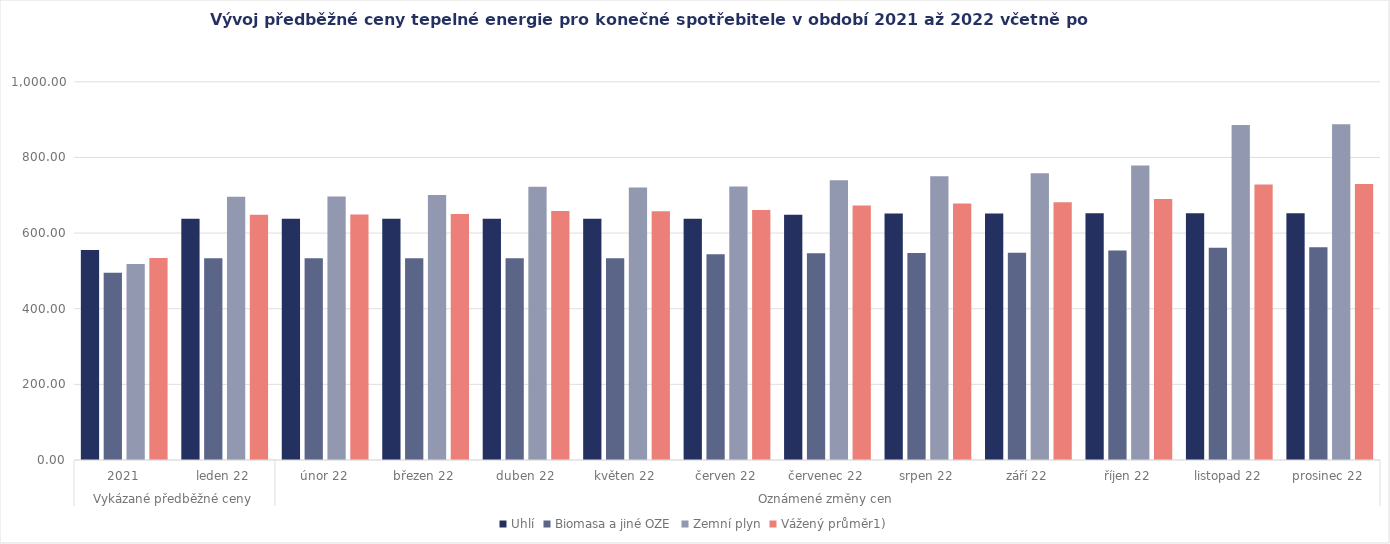
| Category | Uhlí | Biomasa a jiné OZE | Zemní plyn | Vážený průměr1) |
|---|---|---|---|---|
| 0 | 555.538 | 495.363 | 518.187 | 534.275 |
| 1 | 638.007 | 533.733 | 696.096 | 648.715 |
| 2 | 638.128 | 533.733 | 696.981 | 649.097 |
| 3 | 638.128 | 533.733 | 700.547 | 650.394 |
| 4 | 638.13 | 533.736 | 722.827 | 658.473 |
| 5 | 638.137 | 533.736 | 720.423 | 657.612 |
| 6 | 638.137 | 543.774 | 723.103 | 661.213 |
| 7 | 648.388 | 546.561 | 739.749 | 672.861 |
| 8 | 651.724 | 547.23 | 750.485 | 678.543 |
| 9 | 651.724 | 548.037 | 758.488 | 681.776 |
| 10 | 652.165 | 554.083 | 779.008 | 689.89 |
| 11 | 652.165 | 560.909 | 886.073 | 728.783 |
| 12 | 652.763 | 562.288 | 887.573 | 729.746 |